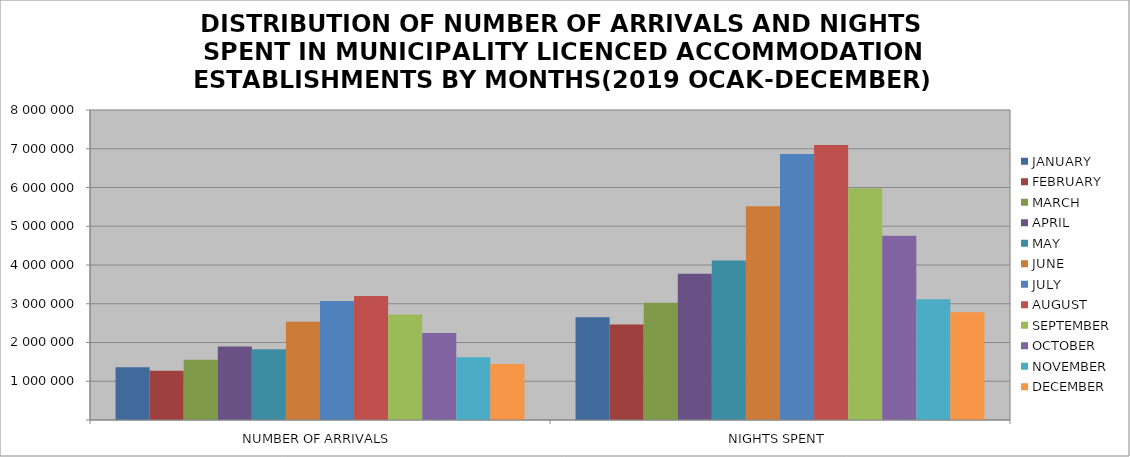
| Category | JANUARY | FEBRUARY | MARCH | APRIL | MAY | JUNE | JULY | AUGUST | SEPTEMBER | OCTOBER | NOVEMBER | DECEMBER |
|---|---|---|---|---|---|---|---|---|---|---|---|---|
| NUMBER OF ARRIVALS | 1363187 | 1273727 | 1552518 | 1898202 | 1826154 | 2537491 | 3073499 | 3201724 | 2721047 | 2242115 | 1617176 | 1445545 |
| NIGHTS SPENT | 2649437 | 2462023 | 3024704 | 3772615 | 4117532 | 5513568 | 6866550 | 7097153 | 5980815 | 4758060 | 3114074 | 2781548 |